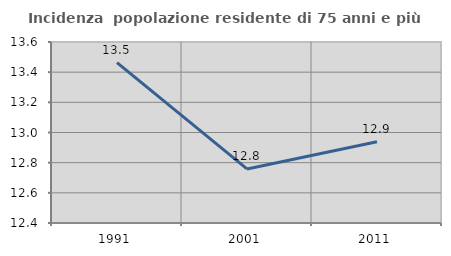
| Category | Incidenza  popolazione residente di 75 anni e più |
|---|---|
| 1991.0 | 13.464 |
| 2001.0 | 12.759 |
| 2011.0 | 12.939 |